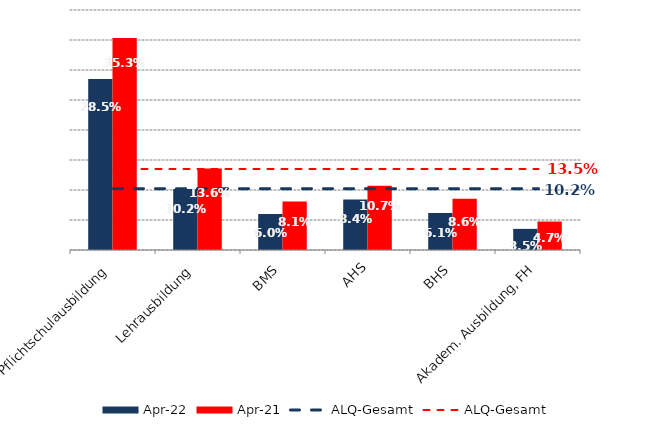
| Category | Apr 22 | Apr 21 |
|---|---|---|
| Pflichtschulausbildung | 0.285 | 0.353 |
| Lehrausbildung | 0.102 | 0.136 |
| BMS | 0.06 | 0.081 |
| AHS | 0.084 | 0.107 |
| BHS | 0.061 | 0.086 |
| Akadem. Ausbildung, FH | 0.035 | 0.047 |